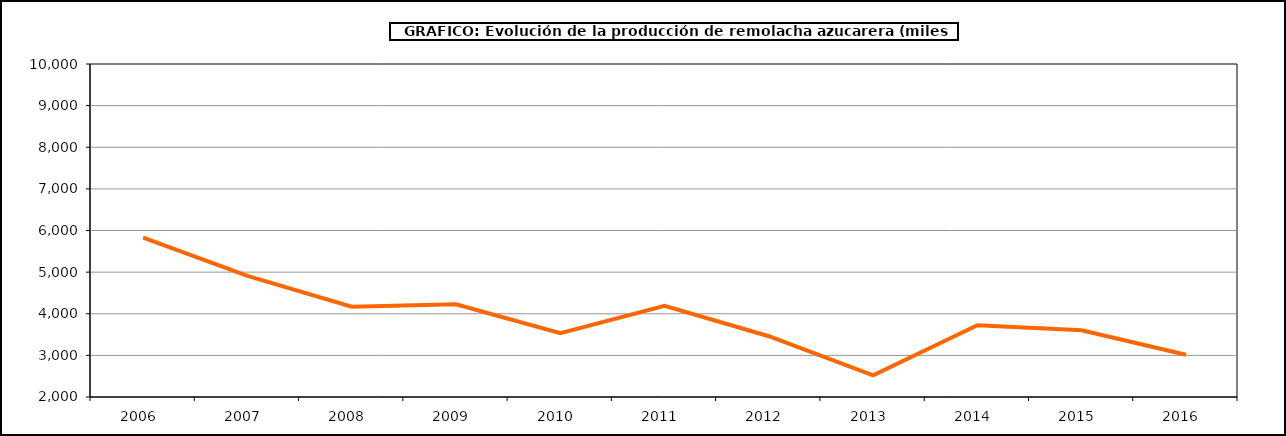
| Category | Producción |
|---|---|
| 2006.0 | 5827.031 |
| 2007.0 | 4909.958 |
| 2008.0 | 4170.442 |
| 2009.0 | 4225.433 |
| 2010.0 | 3534.517 |
| 2011.0 | 4188.535 |
| 2012.0 | 3460.23 |
| 2013.0 | 2519.482 |
| 2014.0 | 3723.309 |
| 2015.0 | 3605.112 |
| 2016.0 | 3014.358 |